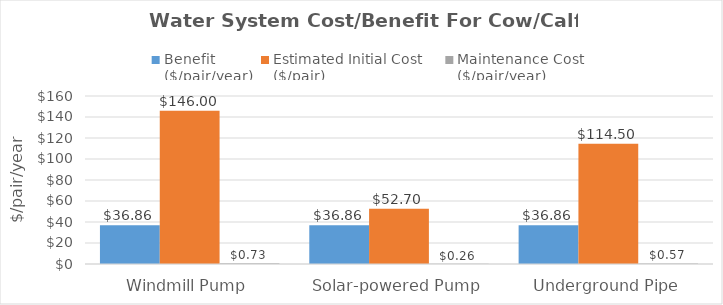
| Category | Benefit 
($/pair/year) | Estimated Initial Cost 
($/pair) | Maintenance Cost
($/pair/year) |
|---|---|---|---|
| Windmill Pump | 36.863 | 146 | 0.73 |
| Solar-powered Pump | 36.863 | 52.7 | 0.264 |
| Underground Pipe | 36.863 | 114.5 | 0.572 |